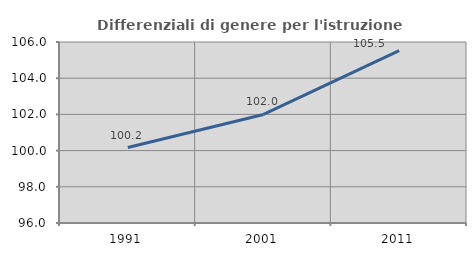
| Category | Differenziali di genere per l'istruzione superiore |
|---|---|
| 1991.0 | 100.169 |
| 2001.0 | 101.999 |
| 2011.0 | 105.523 |